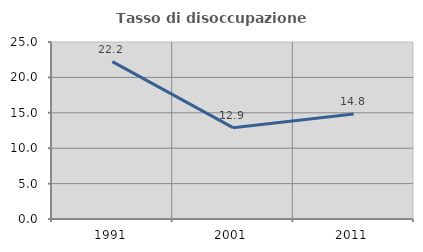
| Category | Tasso di disoccupazione giovanile  |
|---|---|
| 1991.0 | 22.222 |
| 2001.0 | 12.903 |
| 2011.0 | 14.815 |